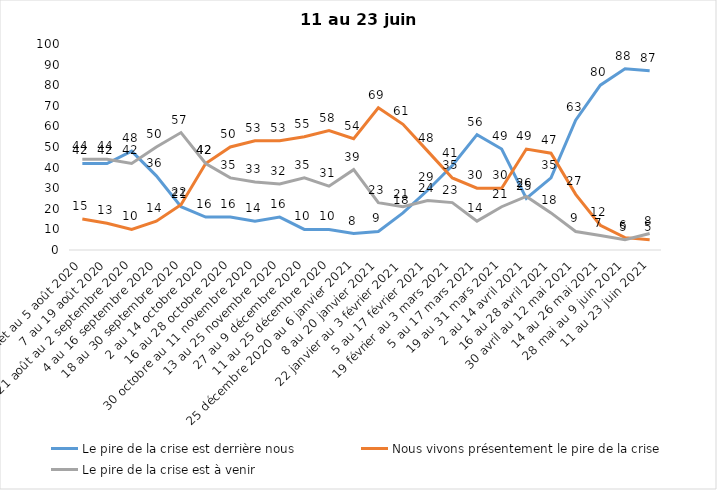
| Category | Le pire de la crise est derrière nous | Nous vivons présentement le pire de la crise | Le pire de la crise est à venir |
|---|---|---|---|
| 24 juillet au 5 août 2020 | 42 | 15 | 44 |
| 7 au 19 août 2020 | 42 | 13 | 44 |
| 21 août au 2 septembre 2020 | 48 | 10 | 42 |
| 4 au 16 septembre 2020 | 36 | 14 | 50 |
| 18 au 30 septembre 2020 | 21 | 22 | 57 |
| 2 au 14 octobre 2020 | 16 | 42 | 42 |
| 16 au 28 octobre 2020 | 16 | 50 | 35 |
| 30 octobre au 11 novembre 2020 | 14 | 53 | 33 |
| 13 au 25 novembre 2020 | 16 | 53 | 32 |
| 27 au 9 décembre 2020 | 10 | 55 | 35 |
| 11 au 25 décembre 2020 | 10 | 58 | 31 |
| 25 décembre 2020 au 6 janvier 2021 | 8 | 54 | 39 |
| 8 au 20 janvier 2021 | 9 | 69 | 23 |
| 22 janvier au 3 février 2021 | 18 | 61 | 21 |
| 5 au 17 février 2021 | 29 | 48 | 24 |
| 19 février au 3 mars 2021 | 41 | 35 | 23 |
| 5 au 17 mars 2021 | 56 | 30 | 14 |
| 19 au 31 mars 2021 | 49 | 30 | 21 |
| 2 au 14 avril 2021 | 25 | 49 | 26 |
| 16 au 28 avril 2021 | 35 | 47 | 18 |
| 30 avril au 12 mai 2021 | 63 | 27 | 9 |
| 14 au 26 mai 2021 | 80 | 12 | 7 |
| 28 mai au 9 juin 2021 | 88 | 6 | 5 |
| 11 au 23 juin 2021 | 87 | 5 | 8 |